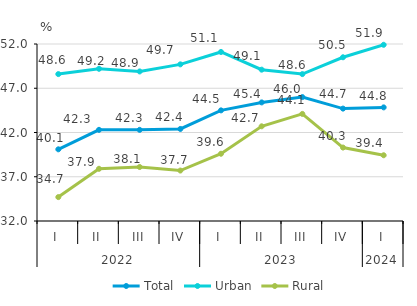
| Category | Total | Urban | Rural |
|---|---|---|---|
| 0 | 40.1 | 48.6 | 34.7 |
| 1 | 42.3 | 49.2 | 37.9 |
| 2 | 42.3 | 48.9 | 38.1 |
| 3 | 42.4 | 49.7 | 37.7 |
| 4 | 44.5 | 51.1 | 39.6 |
| 5 | 45.4 | 49.1 | 42.7 |
| 6 | 46 | 48.6 | 44.1 |
| 7 | 44.7 | 50.5 | 40.3 |
| 8 | 44.838 | 51.911 | 39.429 |